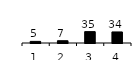
| Category | Series 0 |
|---|---|
| 1.0 | 5 |
| 2.0 | 7 |
| 3.0 | 35 |
| 4.0 | 34 |